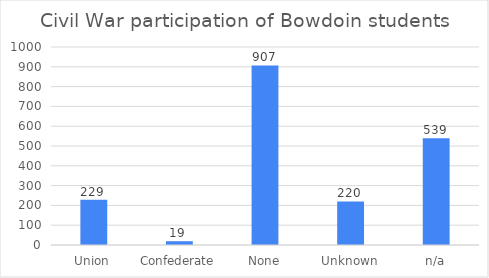
| Category | N |
|---|---|
| Union | 229 |
| Confederate | 19 |
| None | 907 |
| Unknown | 220 |
| n/a | 539 |